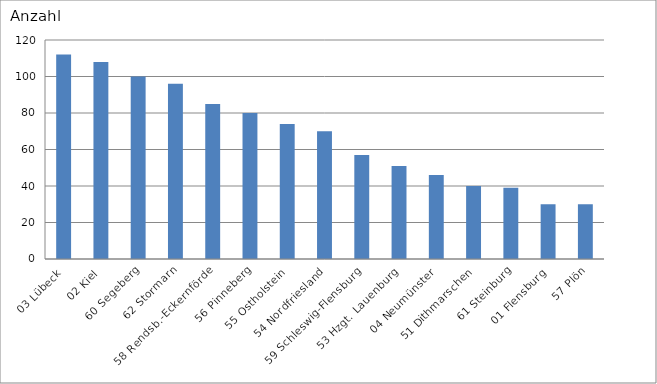
| Category | 03 Lübeck 02 Kiel 60 Segeberg 62 Stormarn 58 Rendsb.-Eckernförde 56 Pinneberg 55 Ostholstein 54 Nordfriesland 59 Schleswig-Flensburg 53 Hzgt. Lauenburg 04 Neumünster 51 Dithmarschen 61 Steinburg 01 Flensburg 57 Plön |
|---|---|
| 03 Lübeck | 112 |
| 02 Kiel | 108 |
| 60 Segeberg | 100 |
| 62 Stormarn | 96 |
| 58 Rendsb.-Eckernförde | 85 |
| 56 Pinneberg | 80 |
| 55 Ostholstein | 74 |
| 54 Nordfriesland | 70 |
| 59 Schleswig-Flensburg | 57 |
| 53 Hzgt. Lauenburg | 51 |
| 04 Neumünster | 46 |
| 51 Dithmarschen | 40 |
| 61 Steinburg | 39 |
| 01 Flensburg | 30 |
| 57 Plön | 30 |